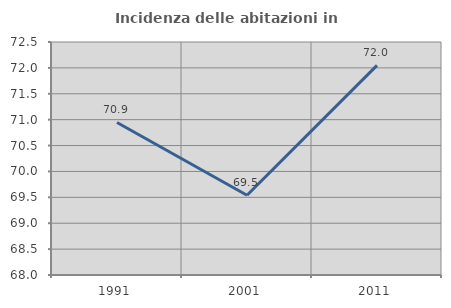
| Category | Incidenza delle abitazioni in proprietà  |
|---|---|
| 1991.0 | 70.946 |
| 2001.0 | 69.54 |
| 2011.0 | 72.05 |